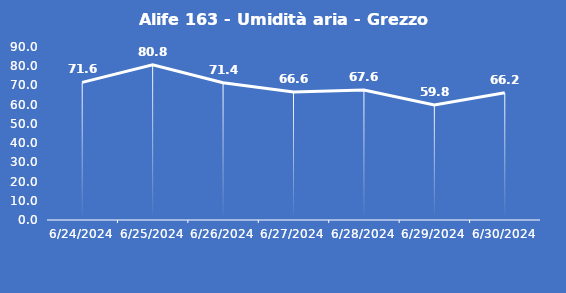
| Category | Alife 163 - Umidità aria - Grezzo (%) |
|---|---|
| 6/24/24 | 71.6 |
| 6/25/24 | 80.8 |
| 6/26/24 | 71.4 |
| 6/27/24 | 66.6 |
| 6/28/24 | 67.6 |
| 6/29/24 | 59.8 |
| 6/30/24 | 66.2 |